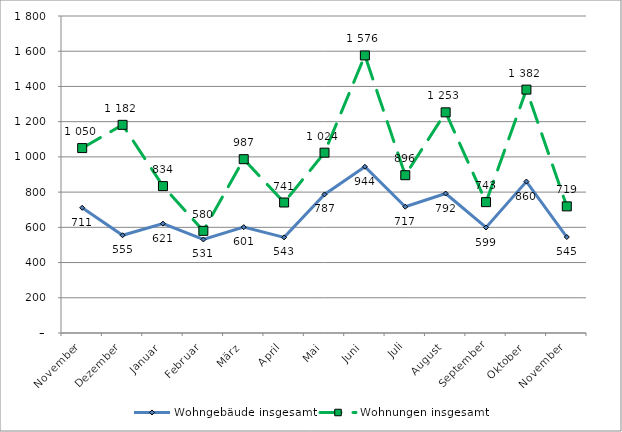
| Category | Wohngebäude insgesamt | Wohnungen insgesamt |
|---|---|---|
| November | 711 | 1050 |
| Dezember | 555 | 1182 |
| Januar | 621 | 834 |
| Februar | 531 | 580 |
| März | 601 | 987 |
| April | 543 | 741 |
| Mai | 787 | 1024 |
| Juni | 944 | 1576 |
| Juli | 717 | 896 |
| August | 792 | 1253 |
| September | 599 | 743 |
| Oktober | 860 | 1382 |
| November | 545 | 719 |